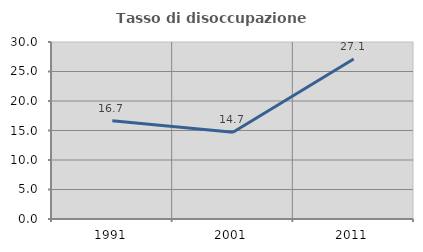
| Category | Tasso di disoccupazione giovanile  |
|---|---|
| 1991.0 | 16.667 |
| 2001.0 | 14.689 |
| 2011.0 | 27.119 |